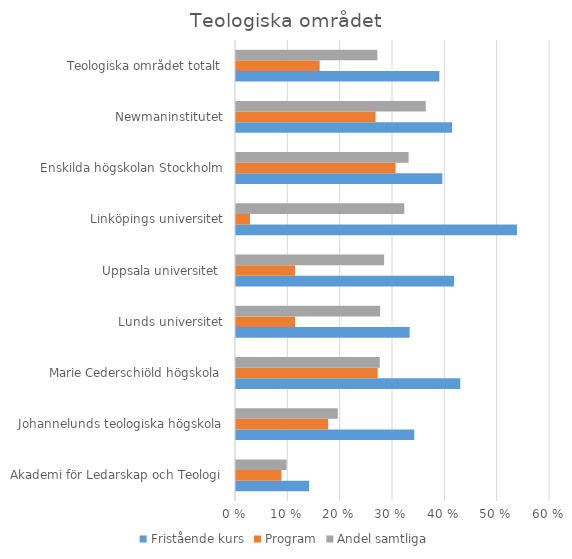
| Category | Fristående kurs | Program | Andel samtliga |
|---|---|---|---|
| Akademi för Ledarskap och Teologi | 0.14 | 0.087 | 0.097 |
| Johannelunds teologiska högskola | 0.341 | 0.176 | 0.194 |
| Marie Cederschiöld högskola | 0.429 | 0.271 | 0.275 |
| Lunds universitet | 0.332 | 0.113 | 0.275 |
| Uppsala universitet  | 0.417 | 0.113 | 0.283 |
| Linköpings universitet | 0.537 | 0.027 | 0.322 |
| Enskilda högskolan Stockholm | 0.394 | 0.305 | 0.33 |
| Newmaninstitutet | 0.413 | 0.267 | 0.363 |
| Teologiska området totalt | 0.389 | 0.16 | 0.27 |